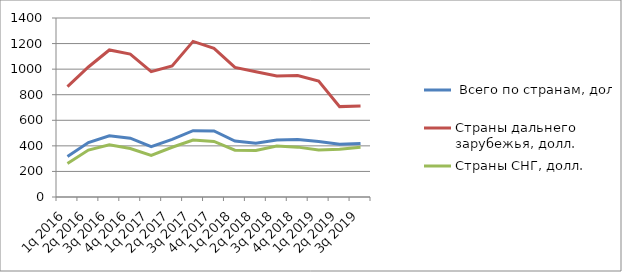
| Category |  Всего по странам, долл. | Страны дальнего зарубежья, долл. | Страны СНГ, долл. |
|---|---|---|---|
| 1q 2016 | 316 | 864 | 262 |
| 2q 2016 | 426 | 1017 | 367 |
| 3q 2016 | 479 | 1150 | 409 |
| 4q 2016 | 460 | 1118 | 379 |
| 1q 2017 | 393 | 980 | 326 |
| 2q 2017 | 451 | 1025 | 389 |
| 3q 2017 | 519 | 1217 | 446 |
| 4q 2017 | 517 | 1162 | 435 |
| 1q 2018 | 438 | 1014 | 366 |
| 2q 2018 | 420 | 980 | 364 |
| 3q 2018 | 446 | 946 | 398 |
| 4q 2018 | 450 | 950 | 390 |
| 1q 2019 | 434 | 906 | 368 |
| 2q 2019 | 413 | 707 | 374 |
| 3q 2019 | 419 | 712 | 389 |